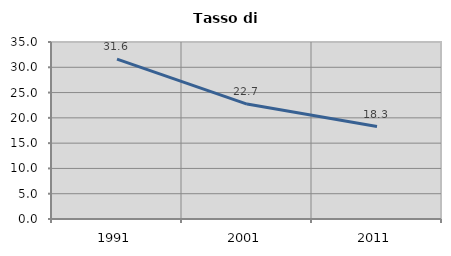
| Category | Tasso di disoccupazione   |
|---|---|
| 1991.0 | 31.616 |
| 2001.0 | 22.724 |
| 2011.0 | 18.283 |